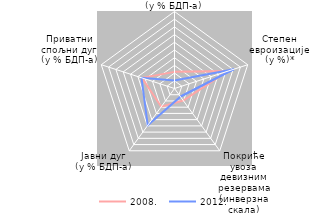
| Category | 2008. | 2012. |
|---|---|---|
| Дефицит платног биланса
(у % БДП-a) | 21.596 | 10.505 |
| Степен
евроизације
(у %)* | 72.995 | 81.15 |
| Покриће увоза девизним резервама
(инверзна скала) | 19.243 | 13.141 |
| Јавни дуг
(у % БДП-a) | 29.233 | 59.161 |
| Приватни
спољни дуг
(у % БДП-a) | 44.593 | 45.062 |